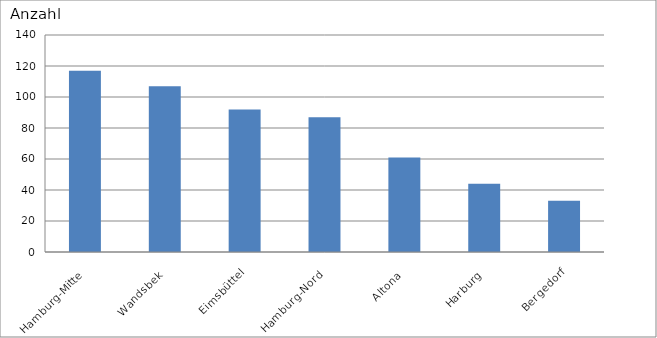
| Category | Hamburg-Mitte Wandsbek Eimsbüttel Hamburg-Nord Altona Harburg Bergedorf |
|---|---|
| Hamburg-Mitte | 117 |
| Wandsbek | 107 |
| Eimsbüttel | 92 |
| Hamburg-Nord | 87 |
| Altona | 61 |
| Harburg | 44 |
| Bergedorf | 33 |